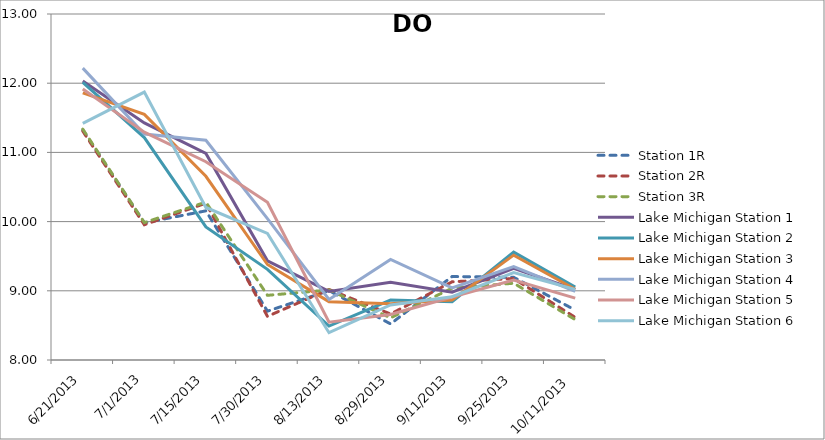
| Category | Station 1R | Station 2R | Station 3R | Lake Michigan Station 1 | Lake Michigan Station 2 | Lake Michigan Station 3 | Lake Michigan Station 4 | Lake Michigan Station 5 | Lake Michigan Station 6 |
|---|---|---|---|---|---|---|---|---|---|
| 6/21/13 | 11.323 | 11.308 | 11.336 | 12.032 | 12.012 | 11.86 | 12.218 | 11.915 | 11.42 |
| 7/1/13 | 9.982 | 9.955 | 9.986 | 11.427 | 11.214 | 11.55 | 11.265 | 11.292 | 11.871 |
| 7/15/13 | 10.156 | 10.266 | 10.282 | 10.985 | 9.922 | 10.655 | 11.176 | 10.866 | 10.204 |
| 7/30/13 | 8.705 | 8.631 | 8.935 | 9.433 | 9.31 | 9.38 | 10.044 | 10.279 | 9.83 |
| 8/13/13 | 9.003 | 9.019 | 9.011 | 8.991 | 8.49 | 8.843 | 8.874 | 8.546 | 8.394 |
| 8/29/13 | 8.521 | 8.665 | 8.609 | 9.122 | 8.866 | 8.815 | 9.453 | 8.657 | 8.795 |
| 9/11/13 | 9.207 | 9.13 | 9.038 | 8.979 | 8.843 | 8.866 | 9.042 | 8.91 | 8.914 |
| 9/25/13 | 9.195 | 9.177 | 9.11 | 9.326 | 9.559 | 9.515 | 9.348 | 9.156 | 9.263 |
| 10/11/13 | 8.721 | 8.616 | 8.584 | 9.019 | 9.055 | 9.022 | 8.993 | 8.893 | 9.02 |